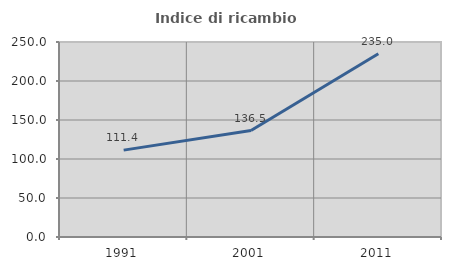
| Category | Indice di ricambio occupazionale  |
|---|---|
| 1991.0 | 111.364 |
| 2001.0 | 136.538 |
| 2011.0 | 235 |